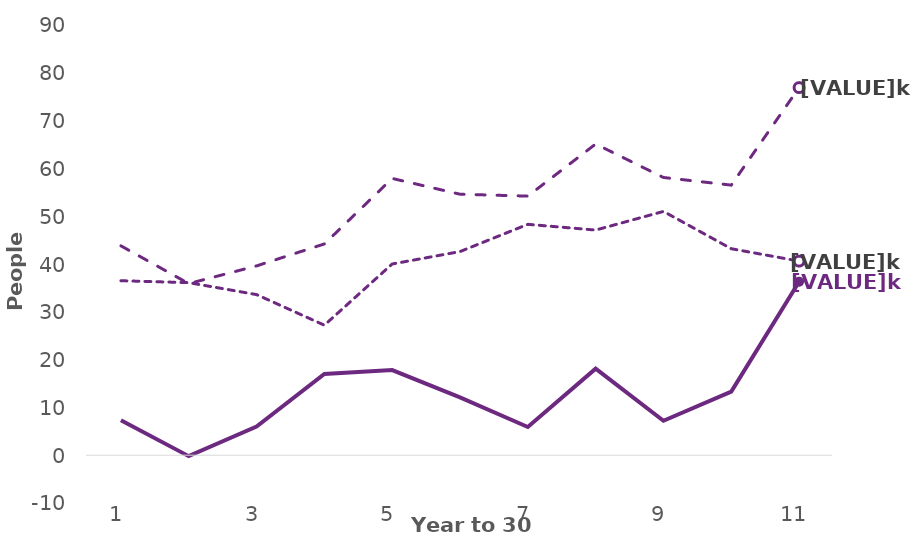
| Category | Net | In | Out |
|---|---|---|---|
| 0 | 7300 | 43800 | 36500 |
| 1 | -200 | 35900 | 36100 |
| 2 | 6000 | 39600 | 33600 |
| 3 | 17000 | 44200 | 27200 |
| 4 | 17800 | 57900 | 40000 |
| 5 | 12100 | 54600 | 42600 |
| 6 | 5900 | 54200 | 48300 |
| 7 | 18100 | 65100 | 47100 |
| 8 | 7200 | 58100 | 51000 |
| 9 | 13300 | 56500 | 43200 |
| 10 | 36300 | 76900 | 40600 |